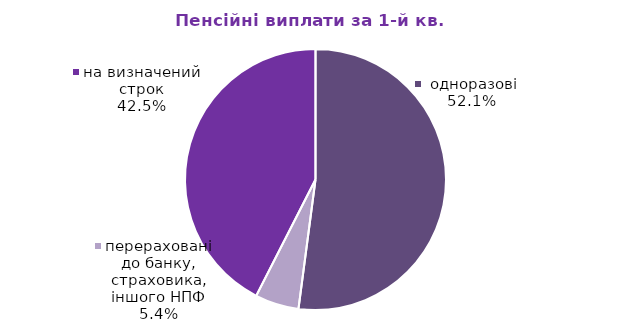
| Category | Series 0 |
|---|---|
| на визначений строк | 7.521 |
|  одноразові | 9.216 |
| перераховані до банку, страховика, іншого НПФ | 0.958 |